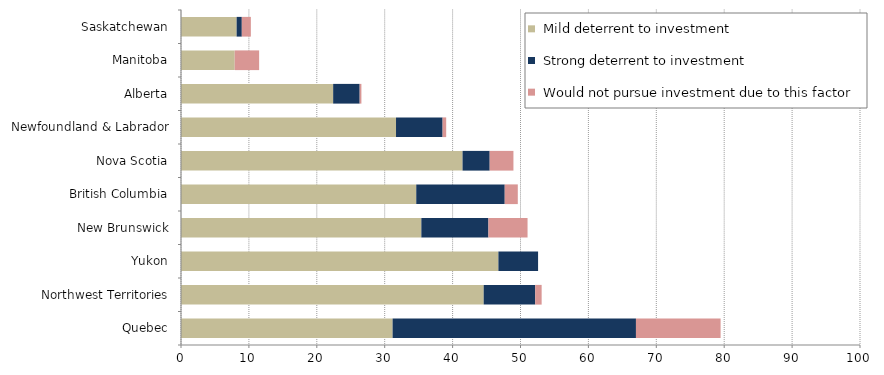
| Category |  Mild deterrent to investment |  Strong deterrent to investment |  Would not pursue investment due to this factor |
|---|---|---|---|
| Quebec | 31.164 | 35.839 | 12.466 |
| Northwest Territories | 44.578 | 7.588 | 0.948 |
| Yukon | 46.746 | 5.843 | 0 |
| New Brunswick | 35.398 | 9.878 | 5.762 |
| British Columbia | 34.647 | 13.03 | 1.925 |
| Nova Scotia | 41.465 | 3.997 | 3.497 |
| Newfoundland & Labrador | 31.667 | 6.861 | 0.528 |
| Alberta | 22.409 | 3.905 | 0.255 |
| Manitoba | 7.911 | 0 | 3.596 |
| Saskatchewan | 8.193 | 0.762 | 1.334 |